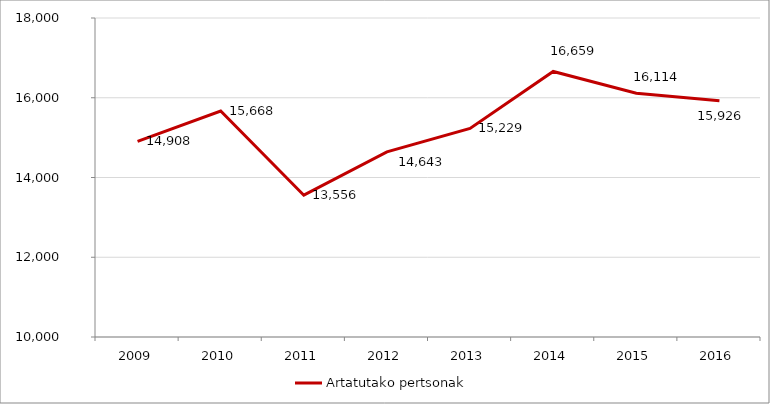
| Category | Artatutako pertsonak |
|---|---|
| 2009.0 | 14908 |
| 2010.0 | 15668 |
| 2011.0 | 13556 |
| 2012.0 | 14643 |
| 2013.0 | 15229 |
| 2014.0 | 16659 |
| 2015.0 | 16114 |
| 2016.0 | 15926 |